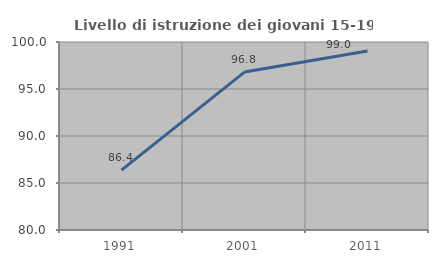
| Category | Livello di istruzione dei giovani 15-19 anni |
|---|---|
| 1991.0 | 86.364 |
| 2001.0 | 96.8 |
| 2011.0 | 99.038 |